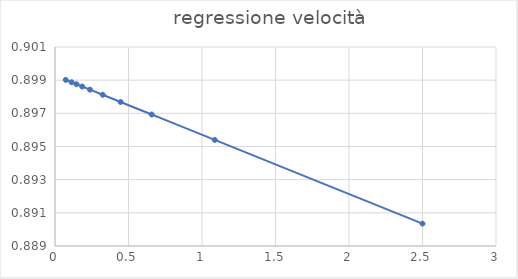
| Category | Series 0 |
|---|---|
| 2.5 | 0.89 |
| 1.0869565217391306 | 0.895 |
| 0.6578947368421053 | 0.897 |
| 0.44642857142857145 | 0.898 |
| 0.3246753246753247 | 0.898 |
| 0.2380952380952381 | 0.898 |
| 0.18518518518518517 | 0.899 |
| 0.14619883040935672 | 0.899 |
| 0.11312217194570136 | 0.899 |
| 0.07331378299120235 | 0.899 |